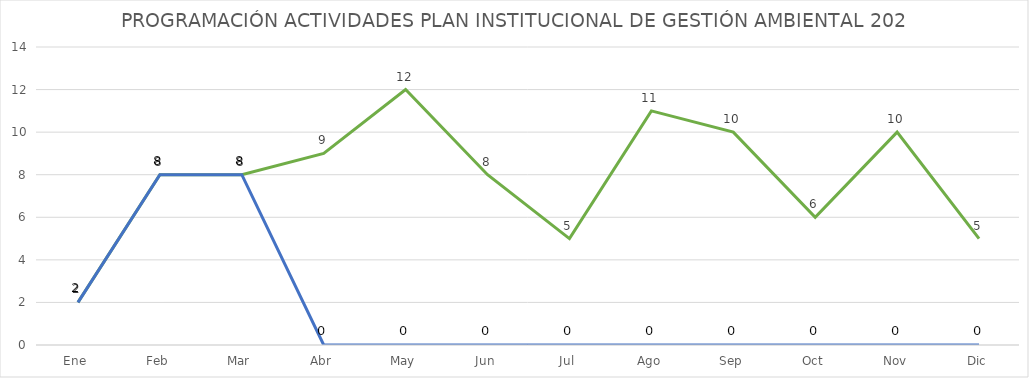
| Category | Series 0 | Series 1 |
|---|---|---|
| Ene | 2 | 2 |
| Feb | 8 | 8 |
| Mar | 8 | 8 |
| Abr | 9 | 0 |
| May | 12 | 0 |
| Jun | 8 | 0 |
| Jul | 5 | 0 |
| Ago | 11 | 0 |
| Sep | 10 | 0 |
| Oct | 6 | 0 |
| Nov | 10 | 0 |
| Dic | 5 | 0 |